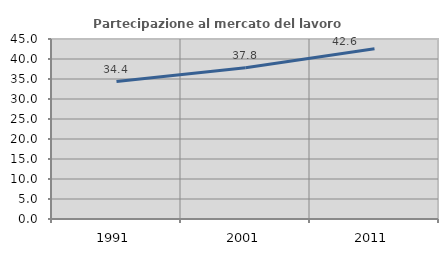
| Category | Partecipazione al mercato del lavoro  femminile |
|---|---|
| 1991.0 | 34.374 |
| 2001.0 | 37.821 |
| 2011.0 | 42.573 |